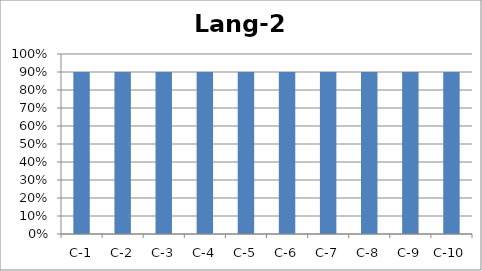
| Category | Lang-2 |
|---|---|
| C-1 | 0.9 |
| C-2 | 0.9 |
| C-3 | 0.9 |
| C-4 | 0.9 |
| C-5 | 0.9 |
| C-6 | 0.9 |
| C-7 | 0.9 |
| C-8 | 0.9 |
| C-9 | 0.9 |
| C-10 | 0.9 |